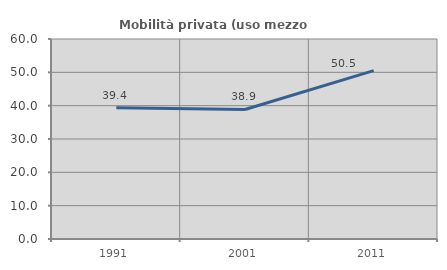
| Category | Mobilità privata (uso mezzo privato) |
|---|---|
| 1991.0 | 39.385 |
| 2001.0 | 38.855 |
| 2011.0 | 50.526 |